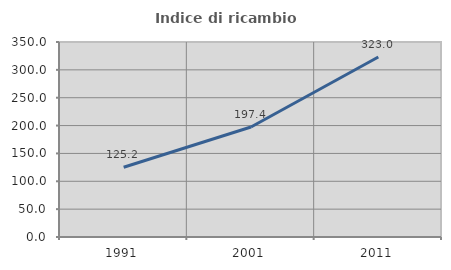
| Category | Indice di ricambio occupazionale  |
|---|---|
| 1991.0 | 125.216 |
| 2001.0 | 197.387 |
| 2011.0 | 323.03 |